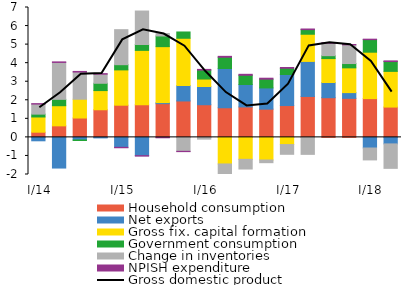
| Category | Household consumption | Net exports | Gross fix. capital formation  | Government consumption | Change in inventories | NPISH expenditure |
|---|---|---|---|---|---|---|
|  I/14 | 0.28 | -0.184 | 0.82 | 0.152 | 0.542 | 0.024 |
| II | 0.622 | -1.652 | 1.085 | 0.343 | 1.99 | 0.029 |
| III | 1.044 | -0.138 | 1.013 | -0.031 | 1.465 | 0.032 |
| IV | 1.489 | -0.028 | 1.034 | 0.394 | 0.49 | 0.028 |
|  I/15 | 1.735 | -0.535 | 1.903 | 0.28 | 1.888 | -0.023 |
| II | 1.758 | -0.985 | 2.931 | 0.316 | 1.804 | -0.023 |
| III | 1.818 | 0.057 | 3.015 | 0.575 | 0.132 | -0.021 |
| IV | 1.963 | 0.833 | 2.547 | 0.339 | -0.752 | -0.016 |
|  I/16 | 1.76 | 0.983 | 0.401 | 0.482 | -0.094 | 0.038 |
| II | 1.597 | 2.114 | -1.433 | 0.609 | -0.552 | 0.048 |
| III | 1.642 | 1.21 | -1.182 | 0.497 | -0.522 | 0.051 |
| IV | 1.522 | 1.144 | -1.219 | 0.47 | -0.144 | 0.053 |
|  I/17 | 1.715 | 1.675 | -0.387 | 0.336 | -0.525 | 0.041 |
| II | 2.206 | 1.888 | 1.465 | 0.248 | -0.915 | 0.035 |
| III | 2.139 | 0.82 | 1.288 | 0.157 | 0.67 | 0.027 |
| IV | 2.104 | 0.31 | 1.333 | 0.233 | 1.008 | 0.018 |
|  I/18 | 2.09 | -0.572 | 2.502 | 0.678 | -0.642 | 0.024 |
| II | 1.634 | -0.351 | 1.923 | 0.53 | -1.318 | 0.036 |